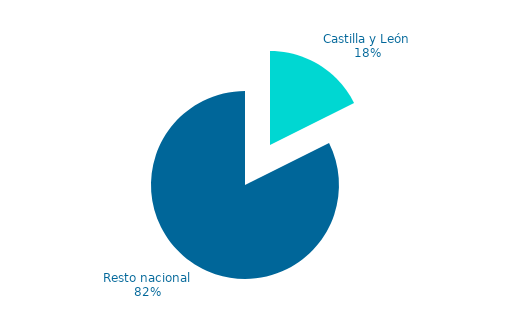
| Category | Series 0 |
|---|---|
| Castilla y León | 7829.005 |
| Resto nacional | 36623.852 |